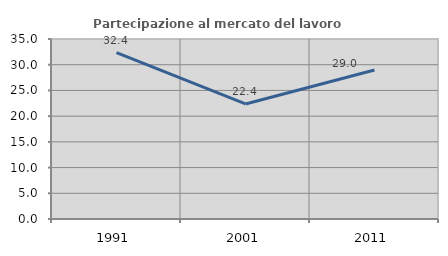
| Category | Partecipazione al mercato del lavoro  femminile |
|---|---|
| 1991.0 | 32.361 |
| 2001.0 | 22.368 |
| 2011.0 | 28.958 |